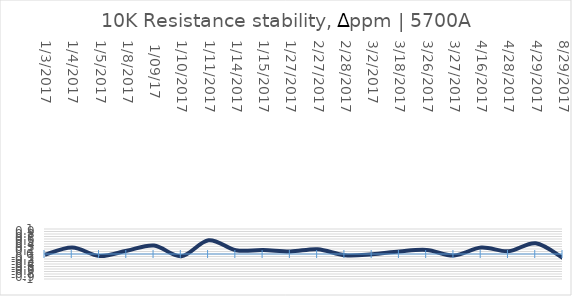
| Category | Series 0 |
|---|---|
| 1/3/2017 | -0.03 |
| 1/4/2017 | 0.26 |
| 1/5/2017 | -0.08 |
| 1/8/2017 | 0.13 |
|  1/09/17 | 0.34 |
| 1/10/2017 | -0.09 |
| 1/11/2017 | 0.55 |
| 1/14/2017 | 0.15 |
| 1/15/2017 | 0.16 |
| 1/27/2017 | 0.1 |
| 2/27/2017 | 0.19 |
| 2/28/2017 | -0.05 |
| 3/2/2017 | -0.01 |
| 3/18/2017 | 0.1 |
| 3/26/2017 | 0.16 |
| 3/27/2017 | -0.06 |
| 4/16/2017 | 0.26 |
| 4/28/2017 | 0.11 |
| 4/29/2017 | 0.43 |
| 8/29/2017 | -0.16 |